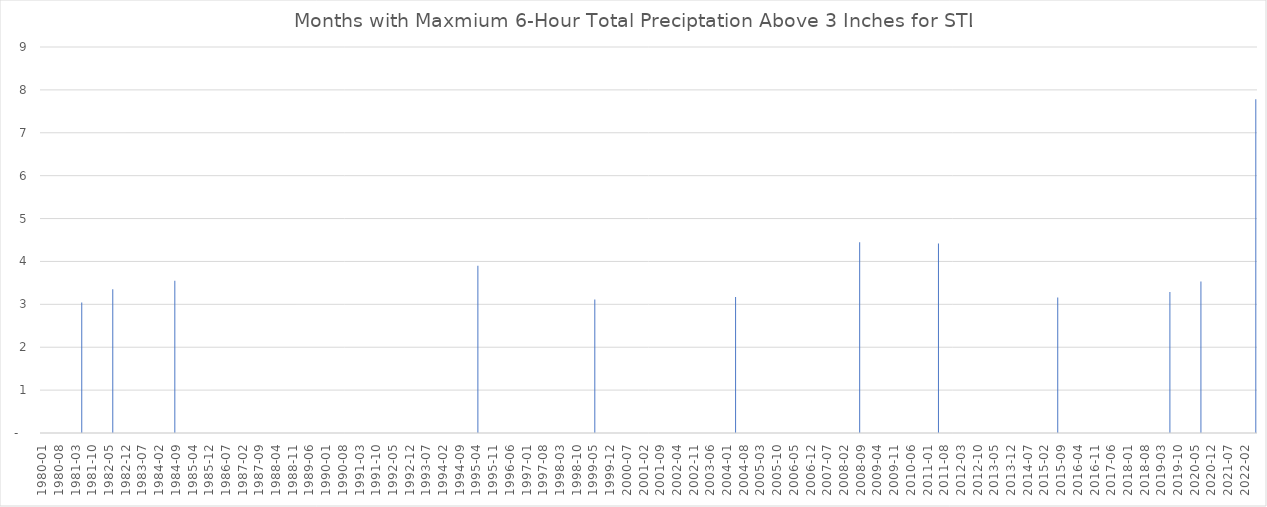
| Category | Series 0 |
|---|---|
| 1980-01 | 0 |
| 1980-02 | 0 |
| 1980-03 | 0 |
| 1980-04 | 0 |
| 1980-05 | 0 |
| 1980-06 | 0 |
| 1980-07 | 0 |
| 1980-08 | 0 |
| 1980-09 | 0 |
| 1980-10 | 0 |
| 1980-11 | 0 |
| 1980-12 | 0 |
| 1981-01 | 0 |
| 1981-02 | 0 |
| 1981-03 | 0 |
| 1981-04 | 0 |
| 1981-05 | 0 |
| 1981-06 | 3.04 |
| 1981-07 | 0 |
| 1981-08 | 0 |
| 1981-09 | 0 |
| 1981-10 | 0 |
| 1981-11 | 0 |
| 1981-12 | 0 |
| 1982-01 | 0 |
| 1982-02 | 0 |
| 1982-03 | 0 |
| 1982-04 | 0 |
| 1982-05 | 0 |
| 1982-06 | 0 |
| 1982-07 | 3.35 |
| 1982-08 | 0 |
| 1982-09 | 0 |
| 1982-10 | 0 |
| 1982-11 | 0 |
| 1982-12 | 0 |
| 1983-01 | 0 |
| 1983-02 | 0 |
| 1983-03 | 0 |
| 1983-04 | 0 |
| 1983-05 | 0 |
| 1983-06 | 0 |
| 1983-07 | 0 |
| 1983-08 | 0 |
| 1983-09 | 0 |
| 1983-10 | 0 |
| 1983-11 | 0 |
| 1983-12 | 0 |
| 1984-01 | 0 |
| 1984-02 | 0 |
| 1984-03 | 0 |
| 1984-04 | 0 |
| 1984-05 | 0 |
| 1984-06 | 0 |
| 1984-07 | 0 |
| 1984-08 | 0 |
| 1984-09 | 3.55 |
| 1984-10 | 0 |
| 1984-11 | 0 |
| 1984-12 | 0 |
| 1985-01 | 0 |
| 1985-02 | 0 |
| 1985-03 | 0 |
| 1985-04 | 0 |
| 1985-05 | 0 |
| 1985-06 | 0 |
| 1985-08 | 0 |
| 1985-09 | 0 |
| 1985-10 | 0 |
| 1985-11 | 0 |
| 1985-12 | 0 |
| 1986-01 | 0 |
| 1986-02 | 0 |
| 1986-03 | 0 |
| 1986-04 | 0 |
| 1986-05 | 0 |
| 1986-06 | 0 |
| 1986-07 | 0 |
| 1986-08 | 0 |
| 1986-09 | 0 |
| 1986-10 | 0 |
| 1986-11 | 0 |
| 1986-12 | 0 |
| 1987-01 | 0 |
| 1987-02 | 0 |
| 1987-03 | 0 |
| 1987-04 | 0 |
| 1987-05 | 0 |
| 1987-06 | 0 |
| 1987-07 | 0 |
| 1987-08 | 0 |
| 1987-09 | 0 |
| 1987-10 | 0 |
| 1987-11 | 0 |
| 1987-12 | 0 |
| 1988-01 | 0 |
| 1988-02 | 0 |
| 1988-03 | 0 |
| 1988-04 | 0 |
| 1988-05 | 0 |
| 1988-06 | 0 |
| 1988-07 | 0 |
| 1988-08 | 0 |
| 1988-09 | 0 |
| 1988-10 | 0 |
| 1988-11 | 0 |
| 1988-12 | 0 |
| 1989-01 | 0 |
| 1989-02 | 0 |
| 1989-03 | 0 |
| 1989-04 | 0 |
| 1989-05 | 0 |
| 1989-06 | 0 |
| 1989-07 | 0 |
| 1989-08 | 0 |
| 1989-09 | 0 |
| 1989-10 | 0 |
| 1989-11 | 0 |
| 1989-12 | 0 |
| 1990-01 | 0 |
| 1990-02 | 0 |
| 1990-03 | 0 |
| 1990-04 | 0 |
| 1990-05 | 0 |
| 1990-06 | 0 |
| 1990-07 | 0 |
| 1990-08 | 0 |
| 1990-09 | 0 |
| 1990-10 | 0 |
| 1990-11 | 0 |
| 1990-12 | 0 |
| 1991-01 | 0 |
| 1991-02 | 0 |
| 1991-03 | 0 |
| 1991-04 | 0 |
| 1991-05 | 0 |
| 1991-06 | 0 |
| 1991-07 | 0 |
| 1991-08 | 0 |
| 1991-09 | 0 |
| 1991-10 | 0 |
| 1991-11 | 0 |
| 1991-12 | 0 |
| 1992-01 | 0 |
| 1992-02 | 0 |
| 1992-03 | 0 |
| 1992-04 | 0 |
| 1992-05 | 0 |
| 1992-06 | 0 |
| 1992-07 | 0 |
| 1992-08 | 0 |
| 1992-09 | 0 |
| 1992-10 | 0 |
| 1992-11 | 0 |
| 1992-12 | 0 |
| 1993-01 | 0 |
| 1993-02 | 0 |
| 1993-03 | 0 |
| 1993-04 | 0 |
| 1993-05 | 0 |
| 1993-06 | 0 |
| 1993-07 | 0 |
| 1993-08 | 0 |
| 1993-09 | 0 |
| 1993-10 | 0 |
| 1993-11 | 0 |
| 1993-12 | 0 |
| 1994-01 | 0 |
| 1994-02 | 0 |
| 1994-03 | 0 |
| 1994-04 | 0 |
| 1994-05 | 0 |
| 1994-06 | 0 |
| 1994-07 | 0 |
| 1994-08 | 0 |
| 1994-09 | 0 |
| 1994-10 | 0 |
| 1994-11 | 0 |
| 1994-12 | 0 |
| 1995-01 | 0 |
| 1995-02 | 0 |
| 1995-03 | 0 |
| 1995-04 | 0 |
| 1995-05 | 3.9 |
| 1995-06 | 0 |
| 1995-07 | 0 |
| 1995-08 | 0 |
| 1995-09 | 0 |
| 1995-10 | 0 |
| 1995-11 | 0 |
| 1995-12 | 0 |
| 1996-01 | 0 |
| 1996-02 | 0 |
| 1996-03 | 0 |
| 1996-04 | 0 |
| 1996-05 | 0 |
| 1996-06 | 0 |
| 1996-07 | 0 |
| 1996-08 | 0 |
| 1996-09 | 0 |
| 1996-10 | 0 |
| 1996-11 | 0 |
| 1996-12 | 0 |
| 1997-01 | 0 |
| 1997-02 | 0 |
| 1997-03 | 0 |
| 1997-04 | 0 |
| 1997-05 | 0 |
| 1997-06 | 0 |
| 1997-07 | 0 |
| 1997-08 | 0 |
| 1997-09 | 0 |
| 1997-10 | 0 |
| 1997-11 | 0 |
| 1997-12 | 0 |
| 1998-01 | 0 |
| 1998-02 | 0 |
| 1998-03 | 0 |
| 1998-04 | 0 |
| 1998-05 | 0 |
| 1998-06 | 0 |
| 1998-07 | 0 |
| 1998-08 | 0 |
| 1998-09 | 0 |
| 1998-10 | 0 |
| 1998-11 | 0 |
| 1998-12 | 0 |
| 1999-01 | 0 |
| 1999-02 | 0 |
| 1999-03 | 0 |
| 1999-04 | 0 |
| 1999-05 | 0 |
| 1999-06 | 3.11 |
| 1999-07 | 0 |
| 1999-08 | 0 |
| 1999-09 | 0 |
| 1999-10 | 0 |
| 1999-11 | 0 |
| 1999-12 | 0 |
| 2000-01 | 0 |
| 2000-02 | 0 |
| 2000-03 | 0 |
| 2000-04 | 0 |
| 2000-05 | 0 |
| 2000-06 | 0 |
| 2000-07 | 0 |
| 2000-08 | 0 |
| 2000-09 | 0 |
| 2000-10 | 0 |
| 2000-11 | 0 |
| 2000-12 | 0 |
| 2001-01 | 0 |
| 2001-02 | 0 |
| 2001-03 | 0 |
| 2001-04 | 0 |
| 2001-05 | 0 |
| 2001-06 | 0 |
| 2001-07 | 0 |
| 2001-08 | 0 |
| 2001-09 | 0 |
| 2001-10 | 0 |
| 2001-11 | 0 |
| 2001-12 | 0 |
| 2002-01 | 0 |
| 2002-02 | 0 |
| 2002-03 | 0 |
| 2002-04 | 0 |
| 2002-05 | 0 |
| 2002-06 | 0 |
| 2002-07 | 0 |
| 2002-08 | 0 |
| 2002-09 | 0 |
| 2002-10 | 0 |
| 2002-11 | 0 |
| 2002-12 | 0 |
| 2003-01 | 0 |
| 2003-02 | 0 |
| 2003-03 | 0 |
| 2003-04 | 0 |
| 2003-05 | 0 |
| 2003-06 | 0 |
| 2003-07 | 0 |
| 2003-08 | 0 |
| 2003-09 | 0 |
| 2003-10 | 0 |
| 2003-11 | 0 |
| 2003-12 | 0 |
| 2004-01 | 0 |
| 2004-02 | 0 |
| 2004-03 | 0 |
| 2004-04 | 0 |
| 2004-05 | 3.17 |
| 2004-06 | 0 |
| 2004-07 | 0 |
| 2004-08 | 0 |
| 2004-09 | 0 |
| 2004-10 | 0 |
| 2004-11 | 0 |
| 2004-12 | 0 |
| 2005-01 | 0 |
| 2005-02 | 0 |
| 2005-03 | 0 |
| 2005-04 | 0 |
| 2005-05 | 0 |
| 2005-06 | 0 |
| 2005-07 | 0 |
| 2005-08 | 0 |
| 2005-09 | 0 |
| 2005-10 | 0 |
| 2005-11 | 0 |
| 2005-12 | 0 |
| 2006-01 | 0 |
| 2006-02 | 0 |
| 2006-03 | 0 |
| 2006-04 | 0 |
| 2006-05 | 0 |
| 2006-06 | 0 |
| 2006-07 | 0 |
| 2006-08 | 0 |
| 2006-09 | 0 |
| 2006-10 | 0 |
| 2006-11 | 0 |
| 2006-12 | 0 |
| 2007-01 | 0 |
| 2007-02 | 0 |
| 2007-03 | 0 |
| 2007-04 | 0 |
| 2007-05 | 0 |
| 2007-06 | 0 |
| 2007-07 | 0 |
| 2007-08 | 0 |
| 2007-09 | 0 |
| 2007-10 | 0 |
| 2007-11 | 0 |
| 2007-12 | 0 |
| 2008-01 | 0 |
| 2008-02 | 0 |
| 2008-03 | 0 |
| 2008-04 | 0 |
| 2008-05 | 0 |
| 2008-06 | 0 |
| 2008-07 | 0 |
| 2008-08 | 0 |
| 2008-09 | 4.45 |
| 2008-10 | 0 |
| 2008-11 | 0 |
| 2008-12 | 0 |
| 2009-01 | 0 |
| 2009-02 | 0 |
| 2009-03 | 0 |
| 2009-04 | 0 |
| 2009-05 | 0 |
| 2009-06 | 0 |
| 2009-07 | 0 |
| 2009-08 | 0 |
| 2009-09 | 0 |
| 2009-10 | 0 |
| 2009-11 | 0 |
| 2009-12 | 0 |
| 2010-01 | 0 |
| 2010-02 | 0 |
| 2010-03 | 0 |
| 2010-04 | 0 |
| 2010-05 | 0 |
| 2010-06 | 0 |
| 2010-07 | 0 |
| 2010-08 | 0 |
| 2010-09 | 0 |
| 2010-10 | 0 |
| 2010-11 | 0 |
| 2010-12 | 0 |
| 2011-01 | 0 |
| 2011-02 | 0 |
| 2011-03 | 0 |
| 2011-04 | 0 |
| 2011-05 | 0 |
| 2011-06 | 4.42 |
| 2011-07 | 0 |
| 2011-08 | 0 |
| 2011-09 | 0 |
| 2011-10 | 0 |
| 2011-11 | 0 |
| 2011-12 | 0 |
| 2012-01 | 0 |
| 2012-02 | 0 |
| 2012-03 | 0 |
| 2012-04 | 0 |
| 2012-05 | 0 |
| 2012-06 | 0 |
| 2012-07 | 0 |
| 2012-08 | 0 |
| 2012-09 | 0 |
| 2012-10 | 0 |
| 2012-11 | 0 |
| 2012-12 | 0 |
| 2013-01 | 0 |
| 2013-02 | 0 |
| 2013-03 | 0 |
| 2013-04 | 0 |
| 2013-05 | 0 |
| 2013-06 | 0 |
| 2013-07 | 0 |
| 2013-08 | 0 |
| 2013-09 | 0 |
| 2013-10 | 0 |
| 2013-11 | 0 |
| 2013-12 | 0 |
| 2014-01 | 0 |
| 2014-02 | 0 |
| 2014-03 | 0 |
| 2014-04 | 0 |
| 2014-05 | 0 |
| 2014-06 | 0 |
| 2014-07 | 0 |
| 2014-08 | 0 |
| 2014-09 | 0 |
| 2014-10 | 0 |
| 2014-11 | 0 |
| 2014-12 | 0 |
| 2015-01 | 0 |
| 2015-02 | 0 |
| 2015-03 | 0 |
| 2015-04 | 0 |
| 2015-05 | 0 |
| 2015-06 | 0 |
| 2015-07 | 0 |
| 2015-08 | 3.16 |
| 2015-09 | 0 |
| 2015-10 | 0 |
| 2015-11 | 0 |
| 2015-12 | 0 |
| 2016-01 | 0 |
| 2016-02 | 0 |
| 2016-03 | 0 |
| 2016-04 | 0 |
| 2016-05 | 0 |
| 2016-06 | 0 |
| 2016-07 | 0 |
| 2016-08 | 0 |
| 2016-09 | 0 |
| 2016-10 | 0 |
| 2016-11 | 0 |
| 2016-12 | 0 |
| 2017-01 | 0 |
| 2017-02 | 0 |
| 2017-03 | 0 |
| 2017-04 | 0 |
| 2017-05 | 0 |
| 2017-06 | 0 |
| 2017-07 | 0 |
| 2017-08 | 0 |
| 2017-09 | 0 |
| 2017-10 | 0 |
| 2017-11 | 0 |
| 2017-12 | 0 |
| 2018-01 | 0 |
| 2018-02 | 0 |
| 2018-03 | 0 |
| 2018-04 | 0 |
| 2018-05 | 0 |
| 2018-06 | 0 |
| 2018-07 | 0 |
| 2018-08 | 0 |
| 2018-09 | 0 |
| 2018-10 | 0 |
| 2018-11 | 0 |
| 2018-12 | 0 |
| 2019-01 | 0 |
| 2019-02 | 0 |
| 2019-03 | 0 |
| 2019-04 | 0 |
| 2019-05 | 0 |
| 2019-06 | 0 |
| 2019-07 | 3.29 |
| 2019-08 | 0 |
| 2019-09 | 0 |
| 2019-10 | 0 |
| 2019-11 | 0 |
| 2019-12 | 0 |
| 2020-01 | 0 |
| 2020-02 | 0 |
| 2020-03 | 0 |
| 2020-04 | 0 |
| 2020-05 | 0 |
| 2020-06 | 0 |
| 2020-07 | 0 |
| 2020-08 | 3.53 |
| 2020-09 | 0 |
| 2020-10 | 0 |
| 2020-11 | 0 |
| 2020-12 | 0 |
| 2021-01 | 0 |
| 2021-02 | 0 |
| 2021-03 | 0 |
| 2021-04 | 0 |
| 2021-05 | 0 |
| 2021-06 | 0 |
| 2021-07 | 0 |
| 2021-08 | 0 |
| 2021-09 | 0 |
| 2021-10 | 0 |
| 2021-11 | 0 |
| 2021-12 | 0 |
| 2022-01 | 0 |
| 2022-02 | 0 |
| 2022-03 | 0 |
| 2022-04 | 0 |
| 2022-05 | 0 |
| 2022-06 | 0 |
| 2022-07 | 7.78 |